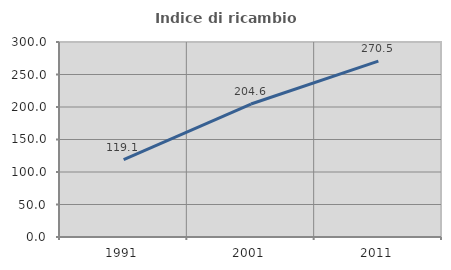
| Category | Indice di ricambio occupazionale  |
|---|---|
| 1991.0 | 119.149 |
| 2001.0 | 204.58 |
| 2011.0 | 270.523 |